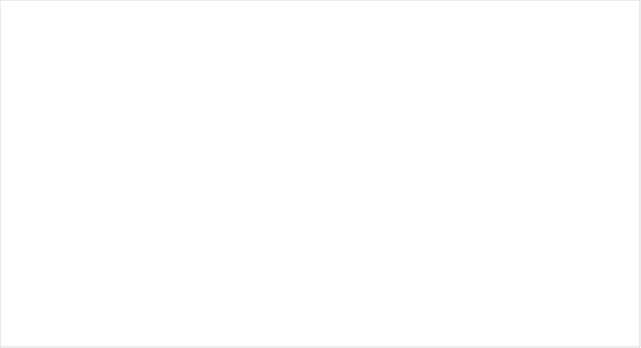
| Category | Material |
|---|---|
| Plastic (Fishing) | 0 |
| Pl. (Consumption) | 0 |
| Pl. (Everyday use) | 0 |
| Pl. Particulate | 0 |
| Rubber | 0 |
| Fabric | 0 |
| Paper and cardboard | 0 |
| Wood | 0 |
| Metal | 0 |
| Glass | 0 |
| Ceramics | 0 |
| health and medical | 0 |
| Others | 0 |